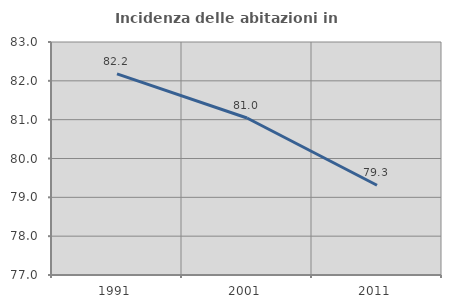
| Category | Incidenza delle abitazioni in proprietà  |
|---|---|
| 1991.0 | 82.178 |
| 2001.0 | 81.043 |
| 2011.0 | 79.31 |